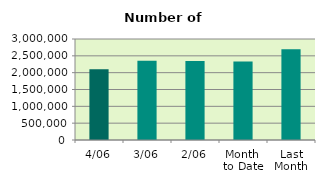
| Category | Series 0 |
|---|---|
| 4/06 | 2100060 |
| 3/06 | 2355280 |
| 2/06 | 2344472 |
| Month 
to Date | 2330534 |
| Last
Month | 2692139.333 |